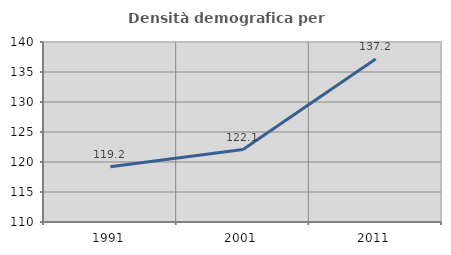
| Category | Densità demografica |
|---|---|
| 1991.0 | 119.201 |
| 2001.0 | 122.074 |
| 2011.0 | 137.154 |